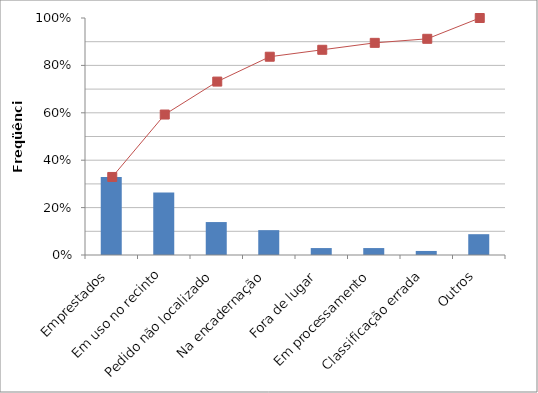
| Category | Problema |
|---|---|
| Emprestados | 0.329 |
| Em uso no recinto | 0.263 |
| Pedido não localizado | 0.139 |
| Na encadernação | 0.105 |
| Fora de lugar | 0.029 |
| Em processamento | 0.029 |
| Classificação errada | 0.017 |
| Outros | 0.088 |